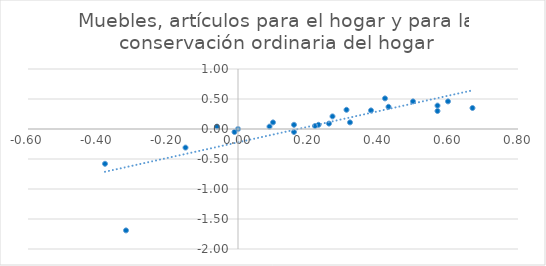
| Category | Muebles, artículos para el hogar y para la conservación ordinaria del hogar |
|---|---|
| 0.38 | 0.31 |
| -0.15 | -0.31 |
| -0.06 | 0.04 |
| 0.32 | 0.11 |
| -0.01 | -0.05 |
| 0.0 | 0 |
| -0.38 | -0.58 |
| -0.32 | -1.69 |
| 0.16 | 0.07 |
| 0.57 | 0.3 |
| 0.67 | 0.35 |
| 0.42 | 0.51 |
| 0.26 | 0.09 |
| 0.1 | 0.11 |
| 0.16 | -0.05 |
| 0.23 | 0.07 |
| 0.09 | 0.04 |
| 0.22 | 0.05 |
| 0.27 | 0.21 |
| 0.31 | 0.32 |
| 0.5 | 0.46 |
| 0.43 | 0.37 |
| 0.57 | 0.39 |
| 0.6 | 0.46 |